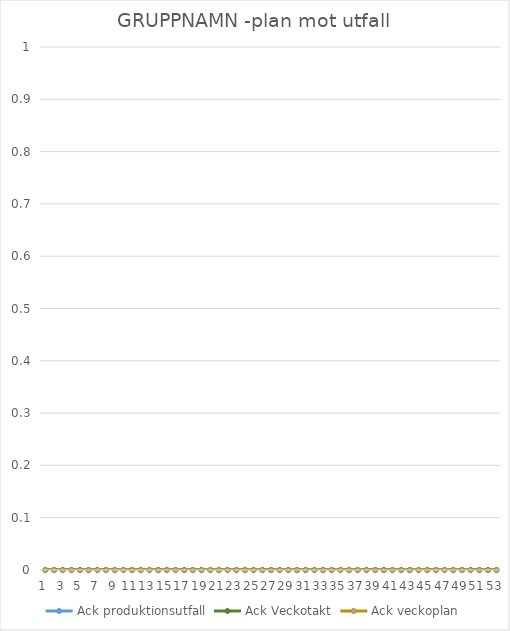
| Category | Ack produktionsutfall | Ack Veckotakt | Ack veckoplan |
|---|---|---|---|
| 0 | 0 | 0 | 0 |
| 1 | 0 | 0 | 0 |
| 2 | 0 | 0 | 0 |
| 3 | 0 | 0 | 0 |
| 4 | 0 | 0 | 0 |
| 5 | 0 | 0 | 0 |
| 6 | 0 | 0 | 0 |
| 7 | 0 | 0 | 0 |
| 8 | 0 | 0 | 0 |
| 9 | 0 | 0 | 0 |
| 10 | 0 | 0 | 0 |
| 11 | 0 | 0 | 0 |
| 12 | 0 | 0 | 0 |
| 13 | 0 | 0 | 0 |
| 14 | 0 | 0 | 0 |
| 15 | 0 | 0 | 0 |
| 16 | 0 | 0 | 0 |
| 17 | 0 | 0 | 0 |
| 18 | 0 | 0 | 0 |
| 19 | 0 | 0 | 0 |
| 20 | 0 | 0 | 0 |
| 21 | 0 | 0 | 0 |
| 22 | 0 | 0 | 0 |
| 23 | 0 | 0 | 0 |
| 24 | 0 | 0 | 0 |
| 25 | 0 | 0 | 0 |
| 26 | 0 | 0 | 0 |
| 27 | 0 | 0 | 0 |
| 28 | 0 | 0 | 0 |
| 29 | 0 | 0 | 0 |
| 30 | 0 | 0 | 0 |
| 31 | 0 | 0 | 0 |
| 32 | 0 | 0 | 0 |
| 33 | 0 | 0 | 0 |
| 34 | 0 | 0 | 0 |
| 35 | 0 | 0 | 0 |
| 36 | 0 | 0 | 0 |
| 37 | 0 | 0 | 0 |
| 38 | 0 | 0 | 0 |
| 39 | 0 | 0 | 0 |
| 40 | 0 | 0 | 0 |
| 41 | 0 | 0 | 0 |
| 42 | 0 | 0 | 0 |
| 43 | 0 | 0 | 0 |
| 44 | 0 | 0 | 0 |
| 45 | 0 | 0 | 0 |
| 46 | 0 | 0 | 0 |
| 47 | 0 | 0 | 0 |
| 48 | 0 | 0 | 0 |
| 49 | 0 | 0 | 0 |
| 50 | 0 | 0 | 0 |
| 51 | 0 | 0 | 0 |
| 52 | 0 | 0 | 0 |